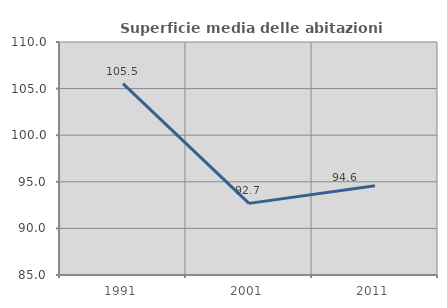
| Category | Superficie media delle abitazioni occupate |
|---|---|
| 1991.0 | 105.535 |
| 2001.0 | 92.687 |
| 2011.0 | 94.579 |